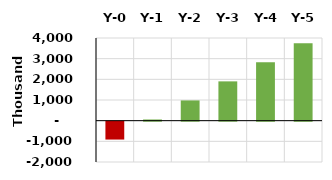
| Category | Series 0 |
|---|---|
| Y-0 | -865457 |
| Y-1 | 56927.615 |
| Y-2 | 979312.231 |
| Y-3 | 1901696.846 |
| Y-4 | 2824081.462 |
| Y-5 | 3746466.077 |